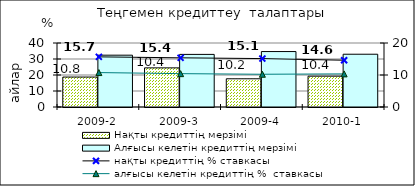
| Category | Нақты кредиттің мерзімі  | Алғысы келетін кредиттің мерзімі  |
|---|---|---|
| 2009-2 | 18.72 | 32.39 |
| 2009-3 | 24.46 | 32.88 |
| 2009-4 | 17.63 | 34.65 |
| 2010-1 | 19.26 | 32.98 |